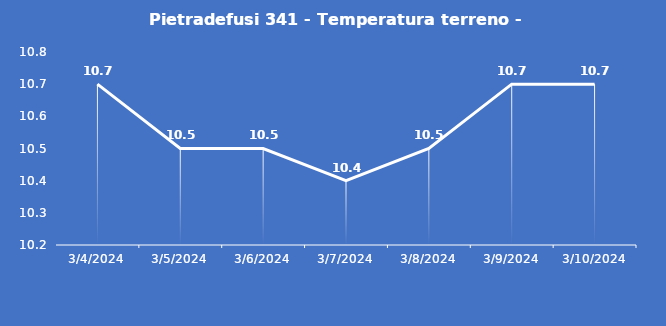
| Category | Pietradefusi 341 - Temperatura terreno - Grezzo (°C) |
|---|---|
| 3/4/24 | 10.7 |
| 3/5/24 | 10.5 |
| 3/6/24 | 10.5 |
| 3/7/24 | 10.4 |
| 3/8/24 | 10.5 |
| 3/9/24 | 10.7 |
| 3/10/24 | 10.7 |